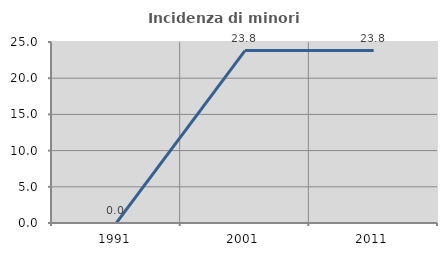
| Category | Incidenza di minori stranieri |
|---|---|
| 1991.0 | 0 |
| 2001.0 | 23.81 |
| 2011.0 | 23.81 |